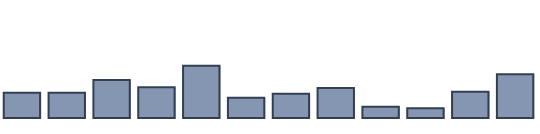
| Category | Series 0 |
|---|---|
| 0 | 7.5 |
| 1 | 7.5 |
| 2 | 11.3 |
| 3 | 9.1 |
| 4 | 15.5 |
| 5 | 6 |
| 6 | 7.2 |
| 7 | 8.9 |
| 8 | 3.3 |
| 9 | 2.9 |
| 10 | 7.8 |
| 11 | 13 |